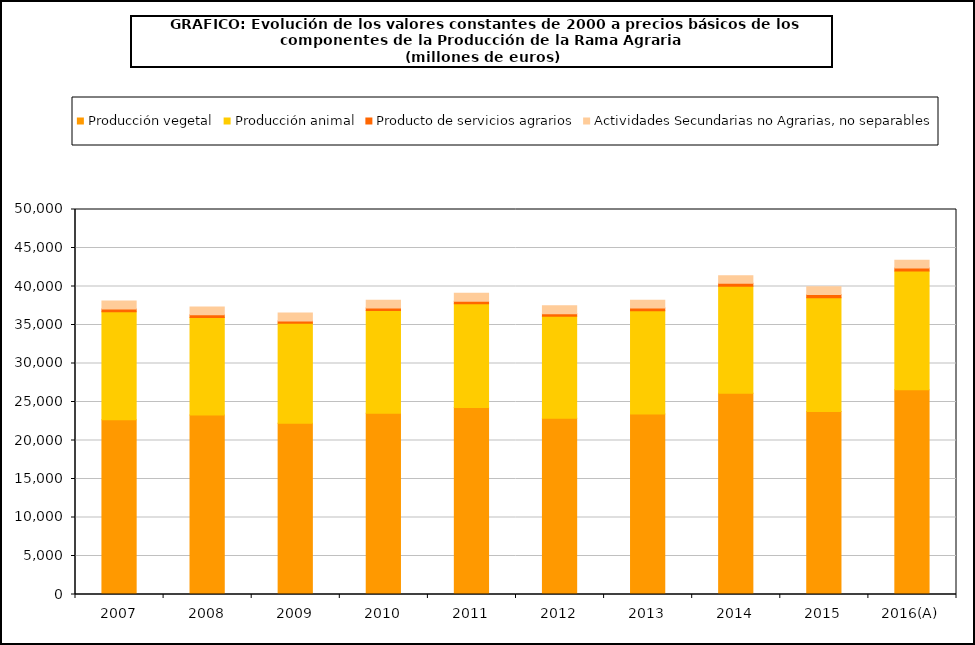
| Category | Producción vegetal | Producción animal | Producto de servicios agrarios | Actividades Secundarias no Agrarias, no separables |
|---|---|---|---|---|
| 2007 | 22693.4 | 14021.5 | 349.2 | 1051.5 |
| 2008 | 23322.7 | 12663.4 | 359.2 | 1000.2 |
| 2009 | 22241.2 | 12972.1 | 307.9 | 1025.1 |
| 2010 | 23535.5 | 13339.7 | 321.6 | 1033.4 |
| 2011 | 24269.6 | 13477 | 327.7 | 1034.7 |
| 2012 | 22902.1 | 13229.7 | 340.4 | 1032.7 |
| 2013 | 23433.2 | 13422.8 | 352 | 1014.7 |
| 2014 | 26123.1 | 13909.9 | 384 | 991.6 |
| 2015 | 23758.8 | 14795.1 | 402.1 | 1014.9 |
| 2016(A) | 26580.4 | 15422.1 | 406.5 | 1005.4 |